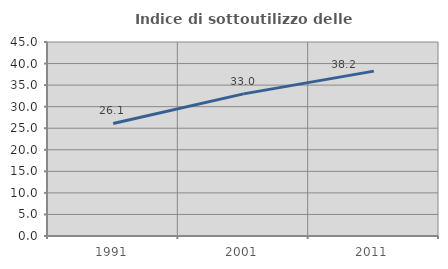
| Category | Indice di sottoutilizzo delle abitazioni  |
|---|---|
| 1991.0 | 26.1 |
| 2001.0 | 32.965 |
| 2011.0 | 38.242 |